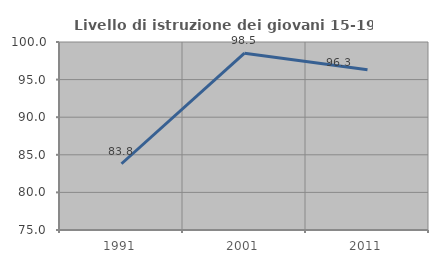
| Category | Livello di istruzione dei giovani 15-19 anni |
|---|---|
| 1991.0 | 83.81 |
| 2001.0 | 98.507 |
| 2011.0 | 96.296 |